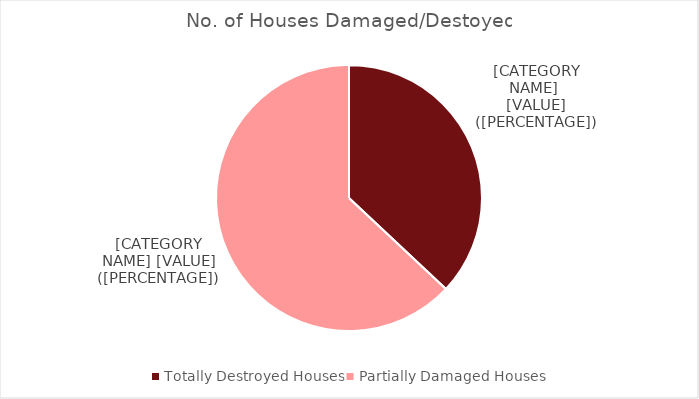
| Category | No. of Houses Damaged/Destoyed |
|---|---|
| Totally Destroyed Houses | 11546 |
| Partially Damaged Houses | 19665 |